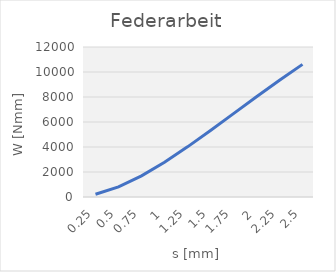
| Category | Series 0 |
|---|---|
| 0.25 | 219.569 |
| 0.5 | 813.925 |
| 0.75 | 1694.374 |
| 1.0 | 2782.651 |
| 1.25 | 4010.931 |
| 1.5 | 5321.82 |
| 1.75 | 6668.362 |
| 2.0 | 8014.035 |
| 2.25 | 9332.751 |
| 2.5 | 10608.857 |